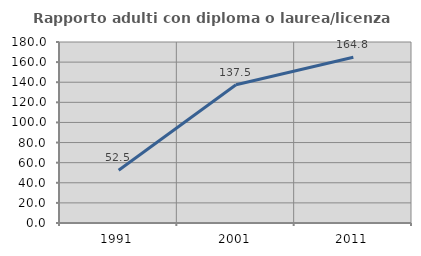
| Category | Rapporto adulti con diploma o laurea/licenza media  |
|---|---|
| 1991.0 | 52.5 |
| 2001.0 | 137.5 |
| 2011.0 | 164.815 |